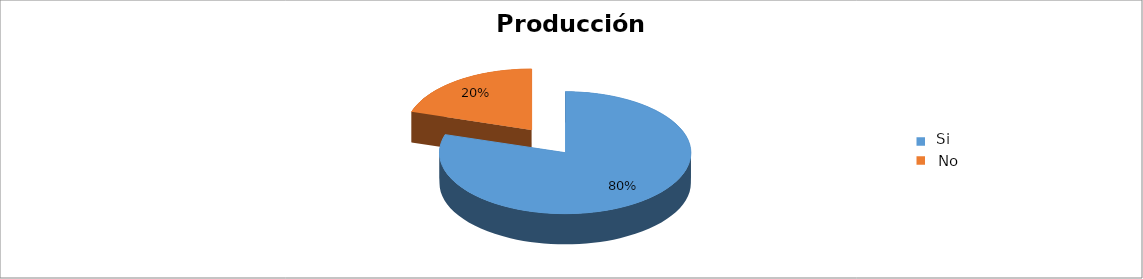
| Category | Series 0 |
|---|---|
| 0 | 0.798 |
| 1 | 0.202 |